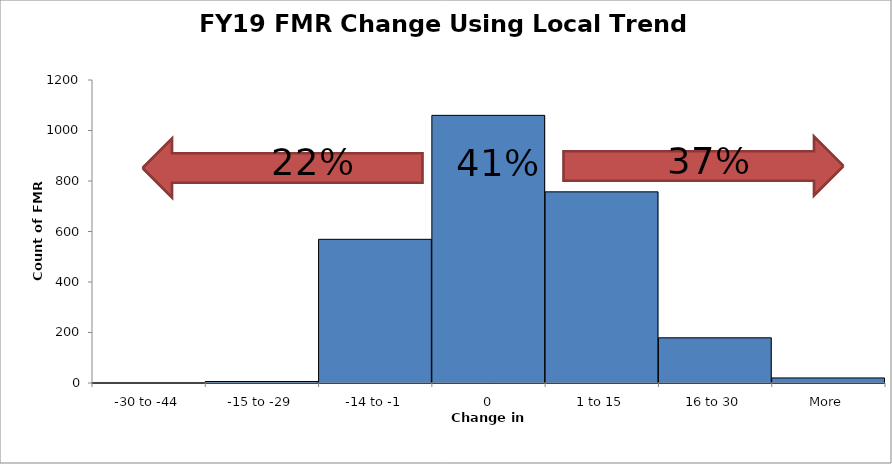
| Category | Frequency |
|---|---|
| -30 to -44 | 2 |
| -15 to -29 | 6 |
| -14 to -1 | 569 |
| 0 | 1060 |
| 1 to 15 | 757 |
| 16 to 30 | 179 |
| More | 20 |